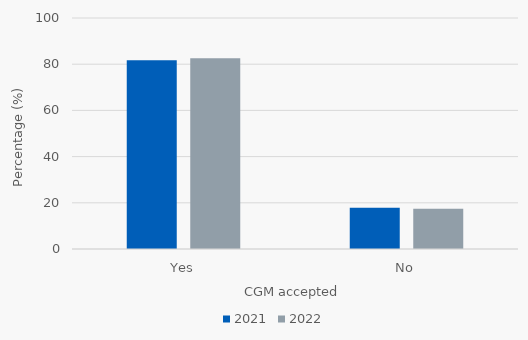
| Category | 2021 | 2022 |
|---|---|---|
| Yes | 81.683 | 82.55 |
| No | 17.822 | 17.45 |